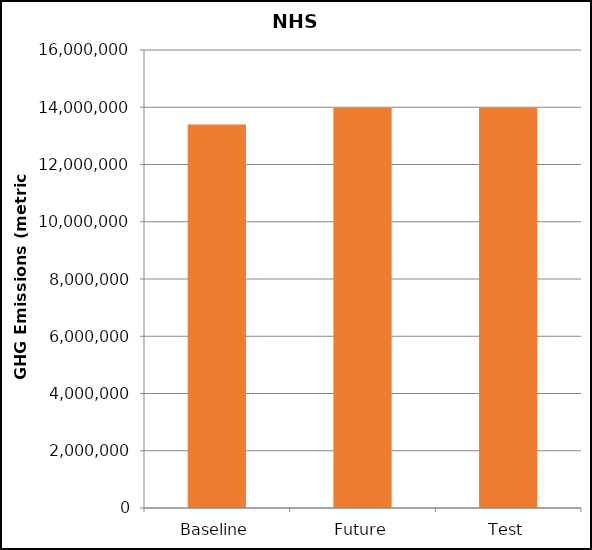
| Category | Total GHG Emissions |
|---|---|
| Baseline | 13399480.244 |
| Future | 13976715.605 |
| Test | 13976715.605 |